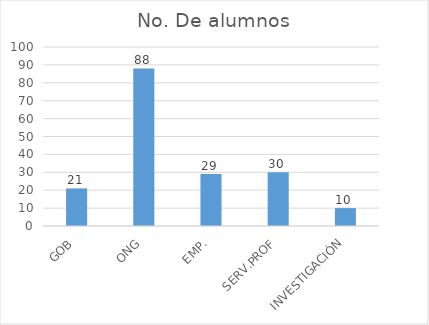
| Category | No. De alumnos |
|---|---|
| GOB | 21 |
| ONG | 88 |
| EMP. | 29 |
| SERV.PROF | 30 |
| INVESTIGACIÓN | 10 |